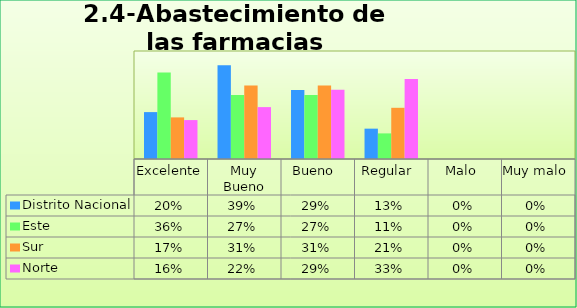
| Category | Distrito Nacional | Este | Sur  | Norte |
|---|---|---|---|---|
| Excelente | 0.195 | 0.36 | 0.173 | 0.162 |
| Muy Bueno | 0.391 | 0.267 | 0.307 | 0.216 |
| Bueno  | 0.287 | 0.267 | 0.307 | 0.288 |
| Regular  | 0.126 | 0.107 | 0.213 | 0.333 |
| Malo  | 0 | 0 | 0 | 0 |
| Muy malo  | 0 | 0 | 0 | 0 |